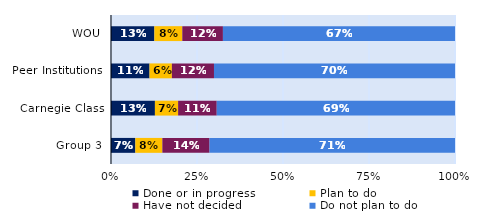
| Category | Done or in progress | Plan to do | Have not decided | Do not plan to do |
|---|---|---|---|---|
| WOU | 0.126 | 0.081 | 0.118 | 0.675 |
| Peer Institutions | 0.112 | 0.065 | 0.122 | 0.701 |
| Carnegie Class | 0.128 | 0.067 | 0.112 | 0.693 |
| Group 3 | 0.071 | 0.079 | 0.137 | 0.714 |